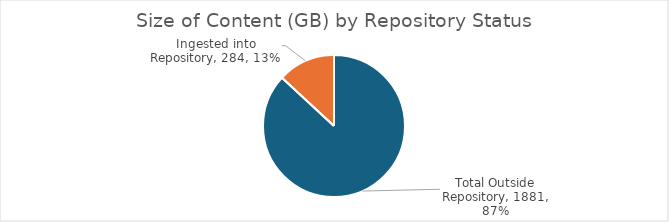
| Category | Size in GB |
|---|---|
| Total Outside Repository | 1881 |
| Ingested into Repository | 284 |